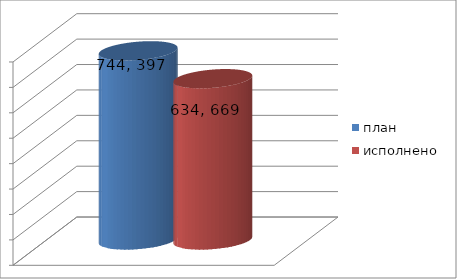
| Category | план | исполнено |
|---|---|---|
| 0 | 744397608.86 | 634669616.13 |